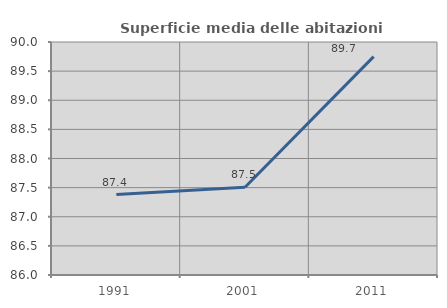
| Category | Superficie media delle abitazioni occupate |
|---|---|
| 1991.0 | 87.38 |
| 2001.0 | 87.507 |
| 2011.0 | 89.749 |